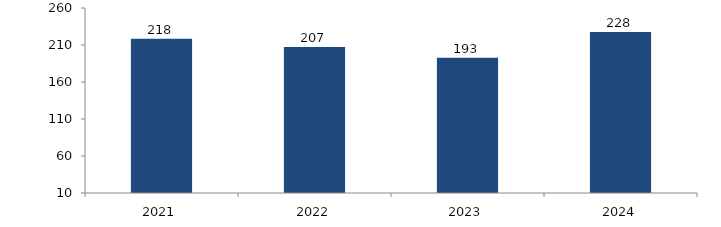
| Category | Bogotá |
|---|---|
| 2021.0 | 218.403 |
| 2022.0 | 207.305 |
| 2023.0 | 192.619 |
| 2024.0 | 227.613 |